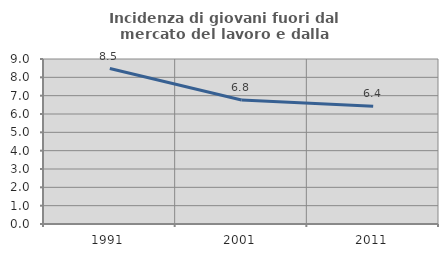
| Category | Incidenza di giovani fuori dal mercato del lavoro e dalla formazione  |
|---|---|
| 1991.0 | 8.48 |
| 2001.0 | 6.767 |
| 2011.0 | 6.422 |